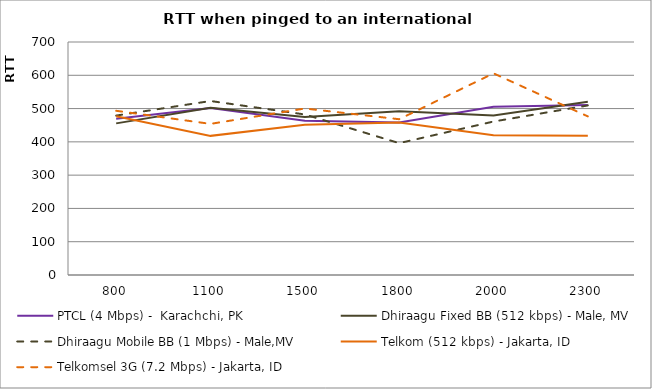
| Category | PTCL (4 Mbps) -  Karachchi, PK | Dhiraagu Fixed BB (512 kbps) - Male, MV | Dhiraagu Mobile BB (1 Mbps) - Male,MV | Telkom (512 kbps) - Jakarta, ID | Telkomsel 3G (7.2 Mbps) - Jakarta, ID |
|---|---|---|---|---|---|
| 800.0 | 469.667 | 455.538 | 478.923 | 477.167 | 493.333 |
| 1100.0 | 501.714 | 502.417 | 522.75 | 418 | 454 |
| 1500.0 | 463.333 | 474.385 | 482.308 | 451.6 | 500.25 |
| 1800.0 | 458.143 | 492.154 | 396.167 | 458 | 468 |
| 2000.0 | 505.667 | 479 | 461.077 | 420 | 605.8 |
| 2300.0 | 510.667 | 520.417 | 509.385 | 418.25 | 476.5 |